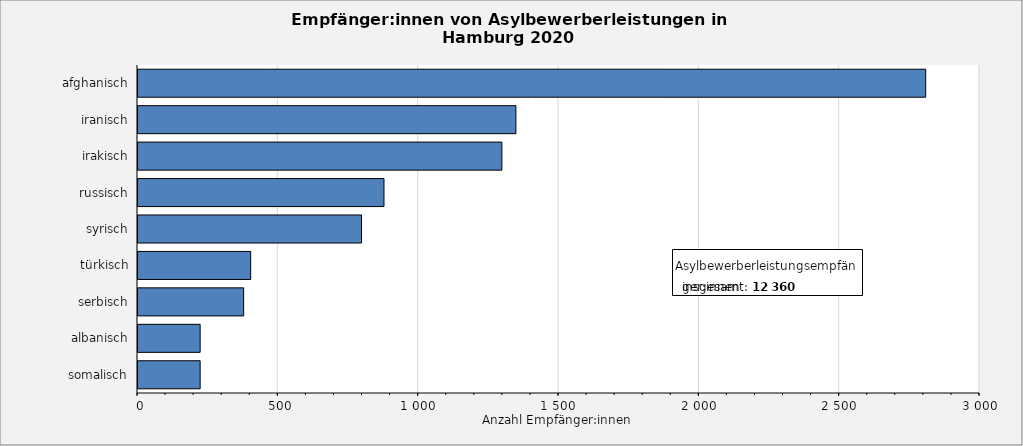
| Category | Anzahl der Empfänger:innen von Asylbewerberleistungen |
|---|---|
| afghanisch | 2810 |
| iranisch | 1350 |
| irakisch | 1300 |
| russisch | 880 |
| syrisch | 800 |
| türkisch | 405 |
| serbisch | 380 |
| albanisch | 225 |
| somalisch | 225 |